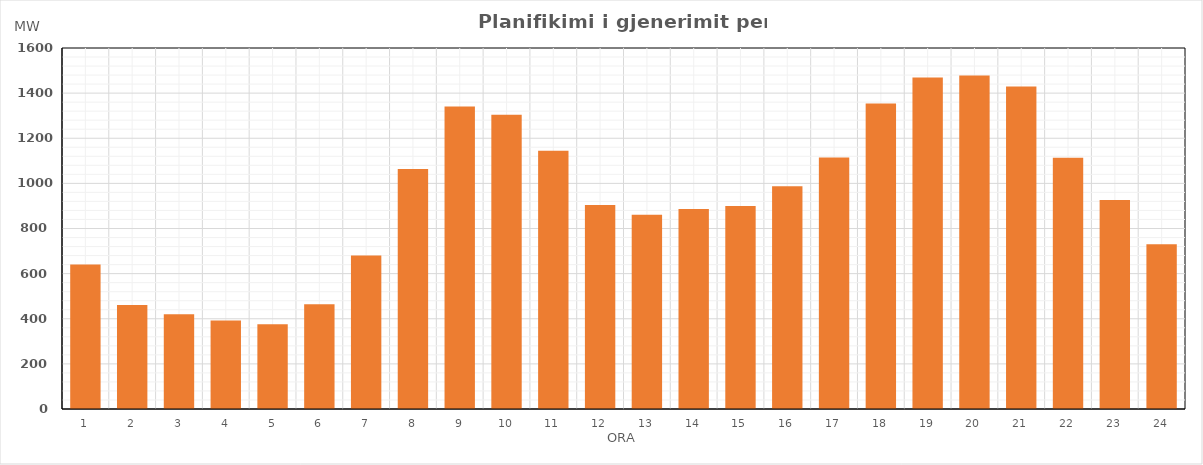
| Category | Max (MW) |
|---|---|
| 0 | 640.48 |
| 1 | 460.99 |
| 2 | 419.56 |
| 3 | 392.48 |
| 4 | 376.16 |
| 5 | 463.95 |
| 6 | 680.29 |
| 7 | 1063.38 |
| 8 | 1341.26 |
| 9 | 1304.1 |
| 10 | 1144.15 |
| 11 | 904.1 |
| 12 | 860.79 |
| 13 | 886.79 |
| 14 | 899.19 |
| 15 | 987.8 |
| 16 | 1114.86 |
| 17 | 1354.12 |
| 18 | 1469.53 |
| 19 | 1478.01 |
| 20 | 1429.77 |
| 21 | 1113.17 |
| 22 | 926.56 |
| 23 | 730.46 |